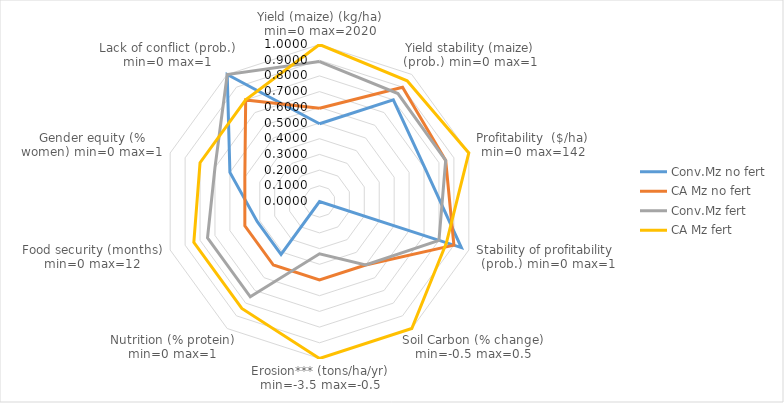
| Category | Conv.Mz no fert | CA Mz no fert | Conv.Mz fert | CA Mz fert |
|---|---|---|---|---|
| Yield (maize) (kg/ha) min=0 max=2020 | 0.495 | 0.594 | 0.891 | 1 |
| Yield stability (maize) (prob.) min=0 max=1 | 0.8 | 0.9 | 0.85 | 0.95 |
| Profitability  ($/ha) min=0 max=142 | 0.704 | 0.845 | 0.845 | 1 |
| Stability of profitability  (prob.) min=0 max=1 | 0.95 | 0.9 | 0.8 | 0.85 |
| Soil Carbon (% change) min=-0.5 max=0.5 | 0 | 0.5 | 0.5 | 1 |
| Erosion*** (tons/ha/yr) min=-3.5 max=-0.5 | 0 | 0.5 | 0.333 | 1 |
| Nutrition (% protein) min=0 max=1 | 0.417 | 0.5 | 0.75 | 0.842 |
| Food security (months) min=0 max=12 | 0.417 | 0.5 | 0.75 | 0.842 |
| Gender equity (% women) min=0 max=1 | 0.6 | 0.5 | 0.7 | 0.8 |
| Lack of conflict (prob.) min=0 max=1 | 1 | 0.8 | 1 | 0.8 |